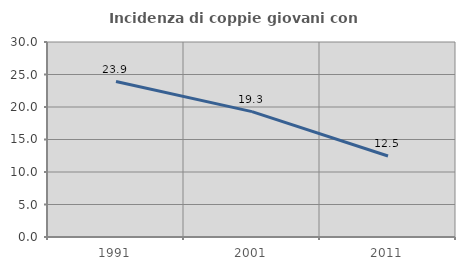
| Category | Incidenza di coppie giovani con figli |
|---|---|
| 1991.0 | 23.923 |
| 2001.0 | 19.29 |
| 2011.0 | 12.456 |